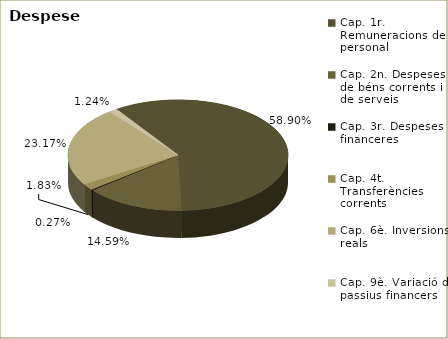
| Category | Series 0 |
|---|---|
| Cap. 1r. Remuneracions de personal | 202116503 |
| Cap. 2n. Despeses de béns corrents i de serveis | 50081993 |
| Cap. 3r. Despeses financeres | 919100 |
| Cap. 4t. Transferències corrents | 6293979 |
| Cap. 6è. Inversions reals | 79493593 |
| Cap. 9è. Variació de passius financers | 4249432 |